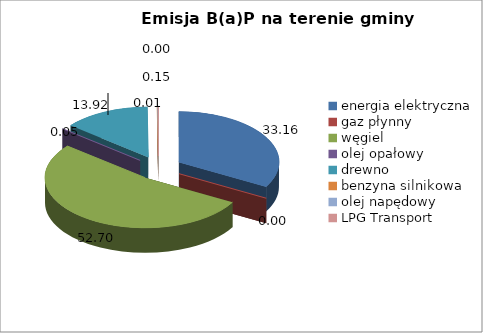
| Category | 33,16 0,00 52,70 0,05 13,92 0,01 0,15 0,00 |
|---|---|
| energia elektryczna | 33.163 |
| gaz płynny | 0 |
| węgiel | 52.697 |
| olej opałowy | 0.049 |
| drewno | 13.925 |
| benzyna silnikowa | 0.014 |
| olej napędowy | 0.153 |
| LPG Transport | 0 |